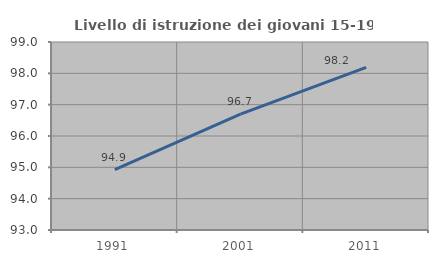
| Category | Livello di istruzione dei giovani 15-19 anni |
|---|---|
| 1991.0 | 94.924 |
| 2001.0 | 96.697 |
| 2011.0 | 98.191 |